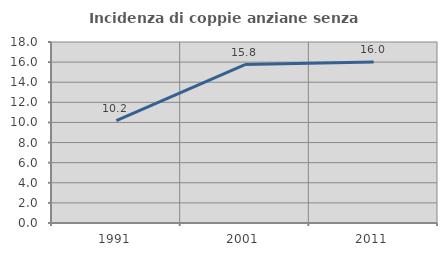
| Category | Incidenza di coppie anziane senza figli  |
|---|---|
| 1991.0 | 10.182 |
| 2001.0 | 15.753 |
| 2011.0 | 16 |